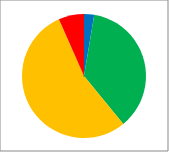
| Category | Count | % |
|---|---|---|
| Outstanding | 4 | 0.026 |
| Good | 55 | 0.364 |
| RI | 82 | 0.543 |
| Inadequate | 10 | 0.066 |